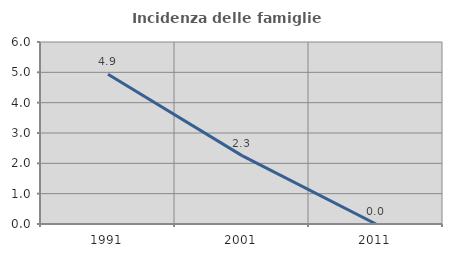
| Category | Incidenza delle famiglie numerose |
|---|---|
| 1991.0 | 4.935 |
| 2001.0 | 2.254 |
| 2011.0 | 0 |